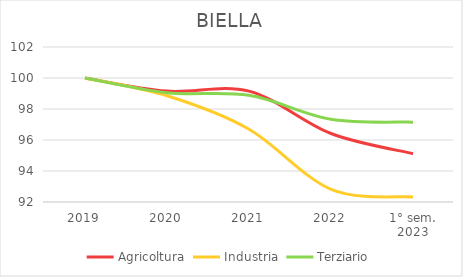
| Category | Agricoltura | Industria | Terziario |
|---|---|---|---|
| 2019 | 100 | 100 | 100 |
| 2020 | 99.154 | 98.855 | 99.051 |
| 2021 | 99.154 | 96.697 | 98.883 |
| 2022 | 96.419 | 92.822 | 97.337 |
| 1° sem.
2023 | 95.117 | 92.325 | 97.153 |